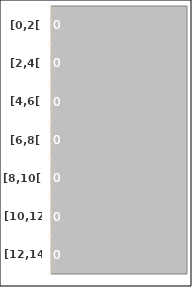
| Category | Series 0 |
|---|---|
| [0,2[ | 0 |
| [2,4[ | 0 |
| [4,6[ | 0 |
| [6,8[ | 0 |
| [8,10[ | 0 |
| [10,12[ | 0 |
| [12,14[ | 0 |